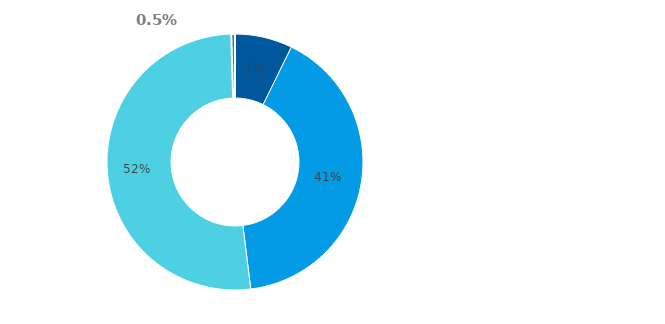
| Category | Series 3 |
|---|---|
| Hotovost | 0.073 |
| Půjčky poskytnuté nemovitostní společnosti | 0.408 |
| Majetkové účasti v nemovitostní společnosti | 0.515 |
| Ostatní finanční aktiva | 0.005 |